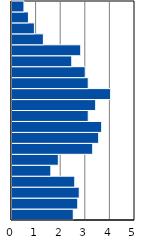
| Category | Series 0 |
|---|---|
| 0-4 | 2.491 |
| 5-9 | 2.673 |
| 10-14 | 2.734 |
| 15-19 | 2.552 |
| 20-24 | 1.58 |
| 25-29 | 1.883 |
| 30-34 | 3.281 |
| 35-39 | 3.524 |
| 40-44 | 3.645 |
| 45-49 | 3.098 |
| 50-54 | 3.402 |
| 55-59 | 4.01 |
| 60-64 | 3.098 |
| 65-69 | 2.977 |
| 70-74 | 2.43 |
| 75-79 | 2.795 |
| 80-84 | 1.276 |
| 85-89 | 0.911 |
| 90-94 | 0.668 |
| 95+ | 0.486 |